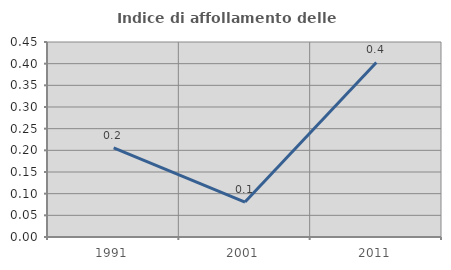
| Category | Indice di affollamento delle abitazioni  |
|---|---|
| 1991.0 | 0.205 |
| 2001.0 | 0.081 |
| 2011.0 | 0.403 |